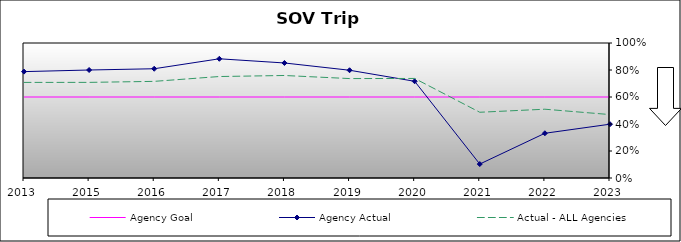
| Category | Agency Goal | Agency Actual | Actual - ALL Agencies |
|---|---|---|---|
| 2013.0 | 0.6 | 0.788 | 0.708 |
| 2015.0 | 0.6 | 0.8 | 0.708 |
| 2016.0 | 0.6 | 0.809 | 0.716 |
| 2017.0 | 0.6 | 0.883 | 0.752 |
| 2018.0 | 0.6 | 0.852 | 0.759 |
| 2019.0 | 0.6 | 0.798 | 0.736 |
| 2020.0 | 0.6 | 0.716 | 0.737 |
| 2021.0 | 0.6 | 0.103 | 0.487 |
| 2022.0 | 0.6 | 0.331 | 0.509 |
| 2023.0 | 0.6 | 0.398 | 0.47 |